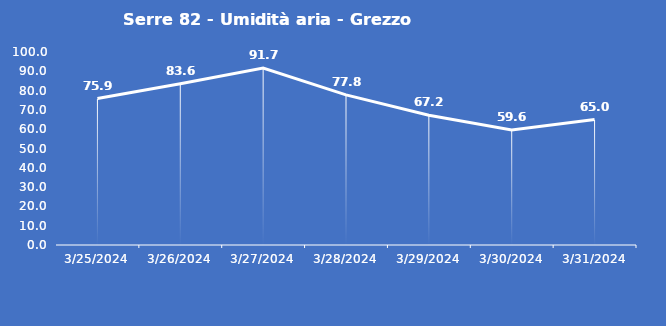
| Category | Serre 82 - Umidità aria - Grezzo (%) |
|---|---|
| 3/25/24 | 75.9 |
| 3/26/24 | 83.6 |
| 3/27/24 | 91.7 |
| 3/28/24 | 77.8 |
| 3/29/24 | 67.2 |
| 3/30/24 | 59.6 |
| 3/31/24 | 65 |